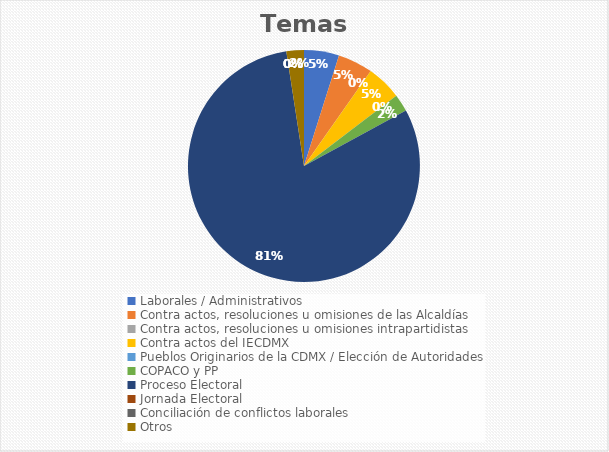
| Category | Temas |
|---|---|
| Laborales / Administrativos | 2 |
| Contra actos, resoluciones u omisiones de las Alcaldías | 2 |
| Contra actos, resoluciones u omisiones intrapartidistas | 0 |
| Contra actos del IECDMX | 2 |
| Pueblos Originarios de la CDMX / Elección de Autoridades | 0 |
| COPACO y PP | 1 |
| Proceso Electoral | 33 |
| Jornada Electoral | 0 |
| Conciliación de conflictos laborales | 0 |
| Otros | 1 |